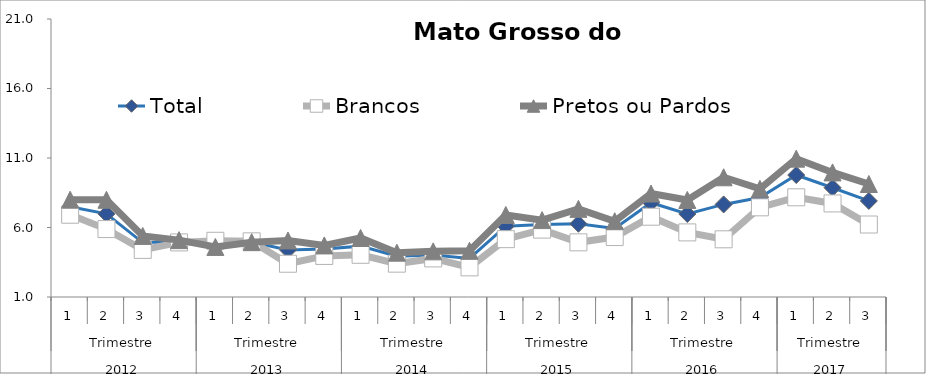
| Category | Total | Brancos | Pretos ou Pardos |
|---|---|---|---|
| 0 | 7.486 | 6.919 | 8.001 |
| 1 | 6.981 | 5.886 | 7.995 |
| 2 | 4.916 | 4.389 | 5.394 |
| 3 | 4.974 | 4.927 | 5.091 |
| 4 | 4.782 | 5.044 | 4.601 |
| 5 | 4.952 | 5.005 | 4.945 |
| 6 | 4.388 | 3.392 | 5.066 |
| 7 | 4.451 | 3.954 | 4.71 |
| 8 | 4.659 | 4.037 | 5.245 |
| 9 | 3.929 | 3.398 | 4.188 |
| 10 | 4.027 | 3.776 | 4.284 |
| 11 | 3.771 | 3.133 | 4.324 |
| 12 | 6.098 | 5.161 | 6.901 |
| 13 | 6.224 | 5.847 | 6.533 |
| 14 | 6.269 | 4.933 | 7.34 |
| 15 | 5.931 | 5.311 | 6.451 |
| 16 | 7.781 | 6.776 | 8.442 |
| 17 | 6.973 | 5.647 | 7.982 |
| 18 | 7.661 | 5.151 | 9.613 |
| 19 | 8.16 | 7.45 | 8.782 |
| 20 | 9.776 | 8.172 | 10.953 |
| 21 | 8.862 | 7.732 | 9.964 |
| 22 | 7.912 | 6.215 | 9.128 |